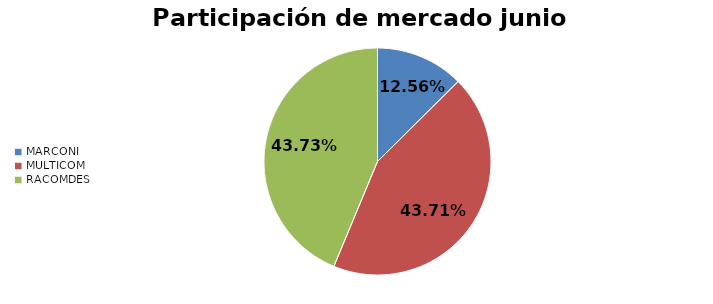
| Category | Series 0 |
|---|---|
| MARCONI | 0.126 |
| MULTICOM | 0.437 |
| RACOMDES | 0.437 |